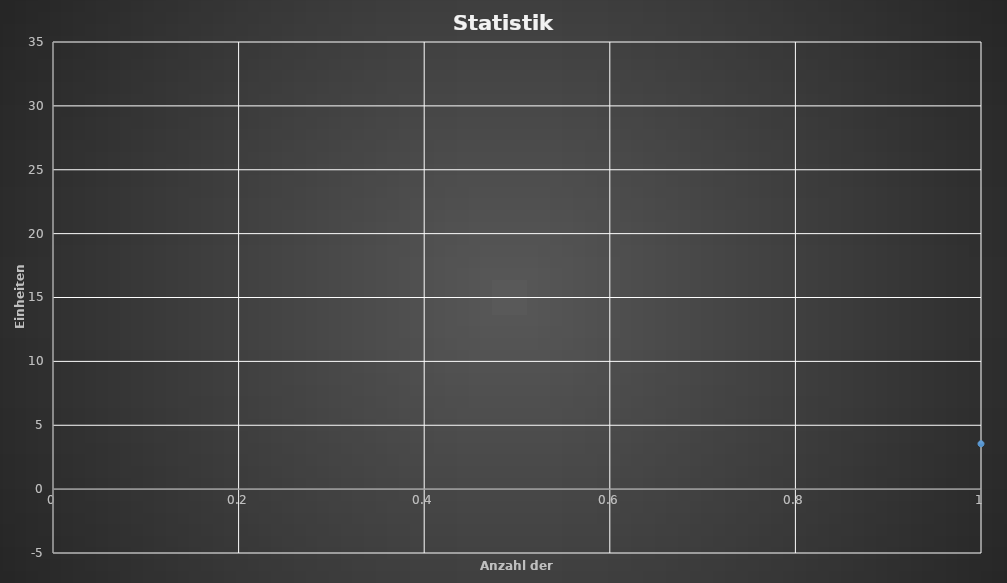
| Category | Series 0 |
|---|---|
| 0 | 3.55 |
| 1 | 5.45 |
| 2 | 7.825 |
| 3 | 9.444 |
| 4 | 8.944 |
| 5 | 7.944 |
| 6 | 6.944 |
| 7 | 8.143 |
| 8 | 7.143 |
| 9 | 6.143 |
| 10 | 5.143 |
| 11 | 3.643 |
| 12 | 7.903 |
| 13 | 10.176 |
| 14 | 12.116 |
| 15 | 11.616 |
| 16 | 13.221 |
| 17 | 14.521 |
| 18 | 15.421 |
| 19 | 16.921 |
| 20 | 15.921 |
| 21 | 14.921 |
| 22 | 16.676 |
| 23 | 16.176 |
| 24 | 17.466 |
| 25 | 19.437 |
| 26 | 17.937 |
| 27 | 17.937 |
| 28 | 16.437 |
| 29 | 15.437 |
| 30 | 10.937 |
| 31 | 9.937 |
| 32 | 8.937 |
| 33 | 7.937 |
| 34 | 6.937 |
| 35 | 6.437 |
| 36 | 4.937 |
| 37 | 6.482 |
| 38 | 6.482 |
| 39 | 4.482 |
| 40 | 2.982 |
| 41 | 1.982 |
| 42 | 0.482 |
| 43 | 1.689 |
| 44 | -0.311 |
| 45 | 0.827 |
| 46 | 4.777 |
| 47 | 2.777 |
| 48 | 2.277 |
| 49 | 0.277 |
| 50 | -0.223 |
| 51 | 2.102 |
| 52 | 4.233 |
| 53 | 3.233 |
| 54 | 4.433 |
| 55 | 5.208 |
| 56 | 8.758 |
| 57 | 10.138 |
| 58 | 9.138 |
| 59 | 7.638 |
| 60 | 9.815 |
| 61 | 10.665 |
| 62 | 11.745 |
| 63 | 10.745 |
| 64 | 11.775 |
| 65 | 13.915 |
| 66 | 16.333 |
| 67 | 15.333 |
| 68 | 16.433 |
| 69 | 18.852 |
| 70 | 17.852 |
| 71 | 18.877 |
| 72 | 20.467 |
| 73 | 19.467 |
| 74 | 22.581 |
| 75 | 23.931 |
| 76 | 22.431 |
| 77 | 20.931 |
| 78 | 19.931 |
| 79 | 21.221 |
| 80 | 22.496 |
| 81 | 23.586 |
| 82 | 24.436 |
| 83 | 28.936 |
| 84 | 27.936 |
| 85 | 29.481 |
| 86 | 27.981 |
| 87 | 26.981 |
| 88 | 25.481 |
| 89 | 26.571 |
| 90 | 25.571 |
| 91 | 30.296 |
| 92 | 29.296 |
| 93 | 27.796 |
| 94 | 26.296 |
| 95 | 27.817 |
| 96 | 26.317 |
| 97 | 25.317 |
| 98 | 24.317 |